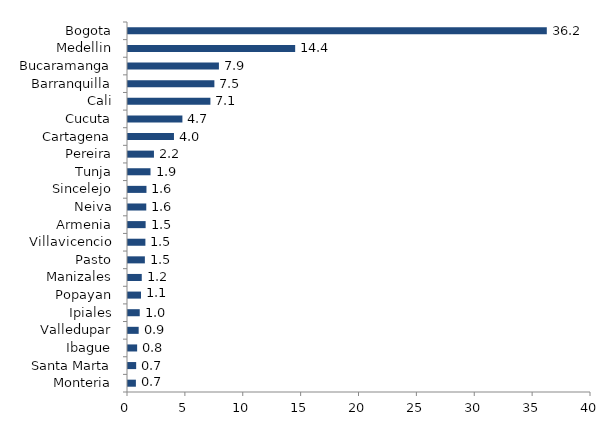
| Category | Series 0 |
|---|---|
| Monteria | 0.682 |
| Santa Marta | 0.705 |
| Ibague | 0.789 |
| Valledupar | 0.922 |
| Ipiales | 1.014 |
| Popayan | 1.122 |
| Manizales | 1.189 |
| Pasto | 1.458 |
| Villavicencio | 1.503 |
| Armenia | 1.523 |
| Neiva | 1.578 |
| Sincelejo | 1.596 |
| Tunja | 1.945 |
| Pereira | 2.242 |
| Cartagena | 3.971 |
| Cucuta | 4.7 |
| Cali | 7.119 |
| Barranquilla | 7.463 |
| Bucaramanga | 7.855 |
| Medellin | 14.442 |
| Bogota | 36.182 |